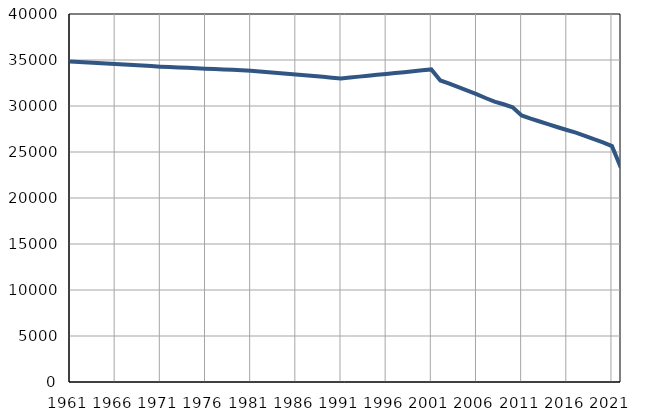
| Category | Population
size |
|---|---|
| 1961.0 | 34836 |
| 1962.0 | 34780 |
| 1963.0 | 34724 |
| 1964.0 | 34668 |
| 1965.0 | 34613 |
| 1966.0 | 34557 |
| 1967.0 | 34502 |
| 1968.0 | 34446 |
| 1969.0 | 34391 |
| 1970.0 | 34335 |
| 1971.0 | 34279 |
| 1972.0 | 34235 |
| 1973.0 | 34192 |
| 1974.0 | 34148 |
| 1975.0 | 34105 |
| 1976.0 | 34061 |
| 1977.0 | 34017 |
| 1978.0 | 33974 |
| 1979.0 | 33930 |
| 1980.0 | 33887 |
| 1981.0 | 33843 |
| 1982.0 | 33759 |
| 1983.0 | 33674 |
| 1984.0 | 33590 |
| 1985.0 | 33505 |
| 1986.0 | 33421 |
| 1987.0 | 33337 |
| 1988.0 | 33252 |
| 1989.0 | 33168 |
| 1990.0 | 33083 |
| 1991.0 | 32999 |
| 1992.0 | 33096 |
| 1993.0 | 33193 |
| 1994.0 | 33291 |
| 1995.0 | 33388 |
| 1996.0 | 33485 |
| 1997.0 | 33582 |
| 1998.0 | 33679 |
| 1999.0 | 33776 |
| 2000.0 | 33874 |
| 2001.0 | 33971 |
| 2002.0 | 32772 |
| 2003.0 | 32437 |
| 2004.0 | 32048 |
| 2005.0 | 31666 |
| 2006.0 | 31294 |
| 2007.0 | 30870 |
| 2008.0 | 30484 |
| 2009.0 | 30187 |
| 2010.0 | 29864 |
| 2011.0 | 28980 |
| 2012.0 | 28627 |
| 2013.0 | 28315 |
| 2014.0 | 28002 |
| 2015.0 | 27688 |
| 2016.0 | 27395 |
| 2017.0 | 27107 |
| 2018.0 | 26760 |
| 2019.0 | 26388 |
| 2020.0 | 26041 |
| 2021.0 | 25639 |
| 2022.0 | 23274 |